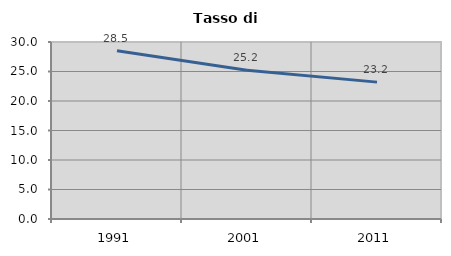
| Category | Tasso di disoccupazione   |
|---|---|
| 1991.0 | 28.503 |
| 2001.0 | 25.229 |
| 2011.0 | 23.2 |